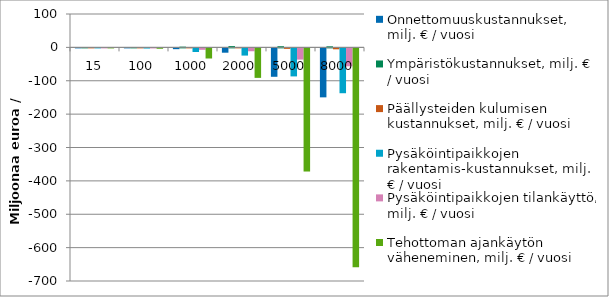
| Category | Onnettomuuskustannukset, milj. € / vuosi | Ympäristökustannukset, milj. € / vuosi | Päällysteiden kulumisen kustannukset, milj. € / vuosi | Pysäköintipaikkojen rakentamis-kustannukset, milj. € / vuosi | Pysäköintipaikkojen tilankäyttö, milj. € / vuosi | Tehottoman ajankäytön väheneminen, milj. € / vuosi |
|---|---|---|---|---|---|---|
| 15.0 | 0.021 | 0.013 | 0.001 | -0.072 | -0.029 | -0.073 |
| 100.0 | 0.266 | 0.176 | 0.018 | -0.48 | -0.192 | -1.111 |
| 1000.0 | -2.374 | 2.121 | 0.11 | -10.8 | -4.32 | -30.312 |
| 2000.0 | -12.97 | 3.878 | 0.029 | -21.6 | -8.64 | -88.397 |
| 5000.0 | -85.124 | 3.487 | -1.48 | -84 | -33.6 | -368.986 |
| 8000.0 | -146.754 | 3.193 | -2.777 | -134.4 | -53.76 | -655.802 |